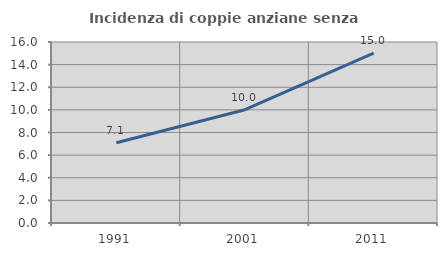
| Category | Incidenza di coppie anziane senza figli  |
|---|---|
| 1991.0 | 7.094 |
| 2001.0 | 10.014 |
| 2011.0 | 15.025 |